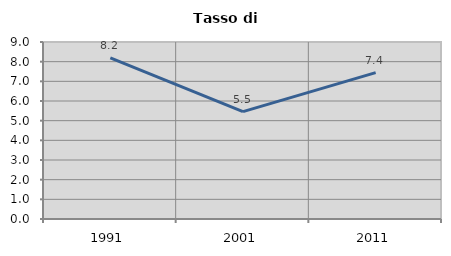
| Category | Tasso di disoccupazione   |
|---|---|
| 1991.0 | 8.197 |
| 2001.0 | 5.462 |
| 2011.0 | 7.444 |